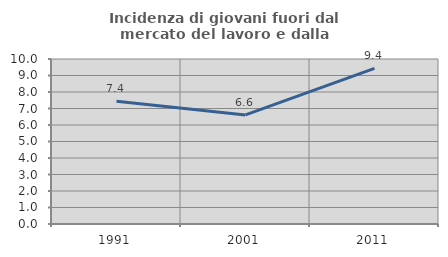
| Category | Incidenza di giovani fuori dal mercato del lavoro e dalla formazione  |
|---|---|
| 1991.0 | 7.444 |
| 2001.0 | 6.612 |
| 2011.0 | 9.429 |